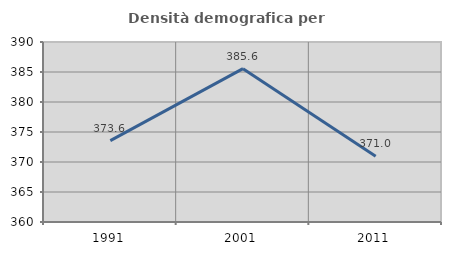
| Category | Densità demografica |
|---|---|
| 1991.0 | 373.565 |
| 2001.0 | 385.556 |
| 2011.0 | 370.954 |